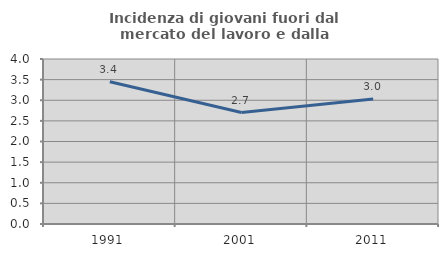
| Category | Incidenza di giovani fuori dal mercato del lavoro e dalla formazione  |
|---|---|
| 1991.0 | 3.448 |
| 2001.0 | 2.703 |
| 2011.0 | 3.03 |